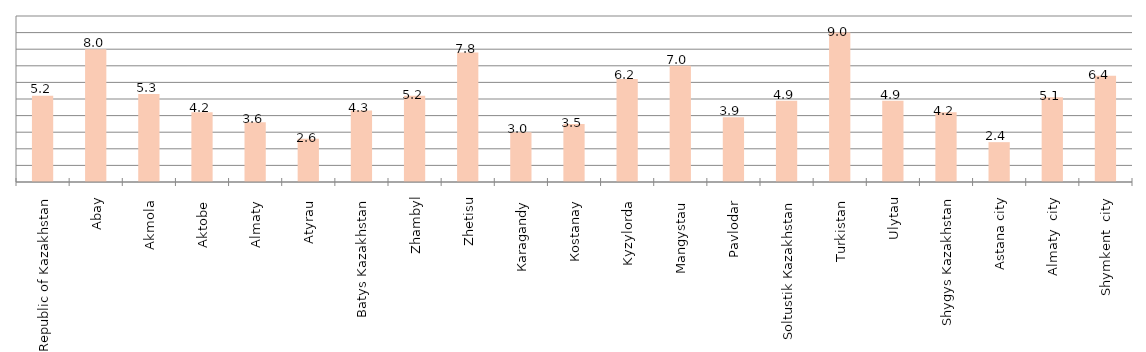
| Category | Series 3 |
|---|---|
| Republic of Kazakhstan | 5.2 |
| Abay | 8 |
| Akmola  | 5.3 |
| Aktobe  | 4.2 |
| Almaty  | 3.6 |
| Atyrau  | 2.6 |
| Batys Kazakhstan  | 4.3 |
| Zhambyl | 5.2 |
| Zhetisu | 7.8 |
| Кaragandy  | 3 |
| Коstanay  | 3.5 |
| Kyzylorda  | 6.2 |
| Мangystau  | 7 |
| Pavlodar  | 3.9 |
| Soltustik Кazakhstan  | 4.9 |
| Turkistan  | 9 |
| Ulytau | 4.9 |
| Shygys Kazakhstan | 4.2 |
| Astana city | 2.4 |
| Almaty  city | 5.1 |
| Shymkent  city | 6.4 |